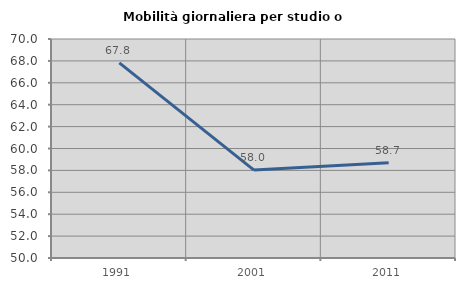
| Category | Mobilità giornaliera per studio o lavoro |
|---|---|
| 1991.0 | 67.816 |
| 2001.0 | 58.029 |
| 2011.0 | 58.696 |